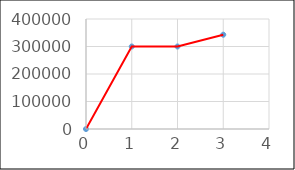
| Category | Series 0 |
|---|---|
| 0.0 | 0 |
| 1.0 | 300000 |
| 2.0 | 300000 |
| 3.0 | 342857.143 |